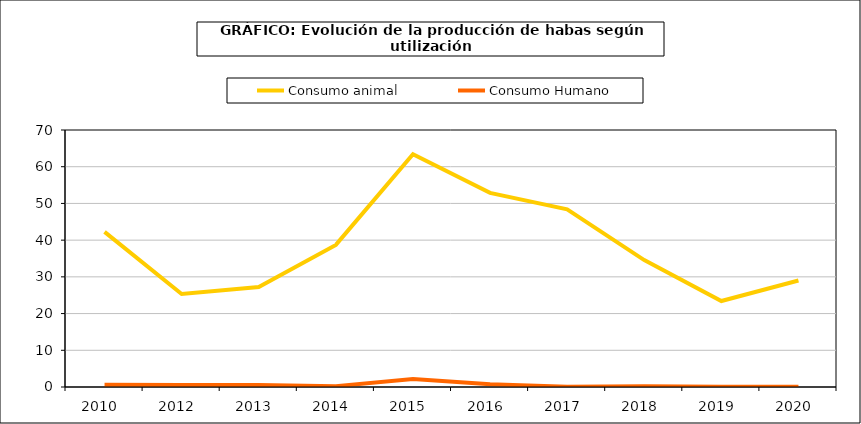
| Category | Consumo animal | Consumo Humano |
|---|---|---|
| 2010  | 42.262 | 0.62 |
| 2012  | 25.317 | 0.571 |
| 2013  | 27.212 | 0.547 |
| 2014  | 38.703 | 0.238 |
| 2015  | 63.379 | 2.153 |
| 2016  | 52.865 | 0.76 |
| 2017  | 48.372 | 0.096 |
| 2018  | 34.561 | 0.189 |
| 2019  | 23.41 | 0.082 |
| 2020  | 28.993 | 0.073 |